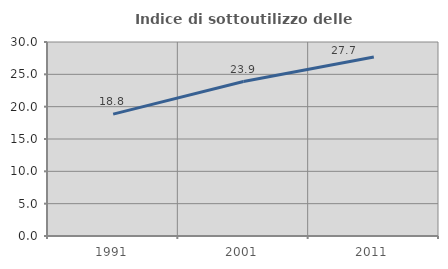
| Category | Indice di sottoutilizzo delle abitazioni  |
|---|---|
| 1991.0 | 18.847 |
| 2001.0 | 23.883 |
| 2011.0 | 27.665 |